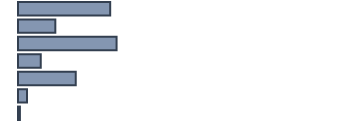
| Category | Percentatge |
|---|---|
| 0 | 28.9 |
| 1 | 11.7 |
| 2 | 30.9 |
| 3 | 7.1 |
| 4 | 18.1 |
| 5 | 2.8 |
| 6 | 0.6 |